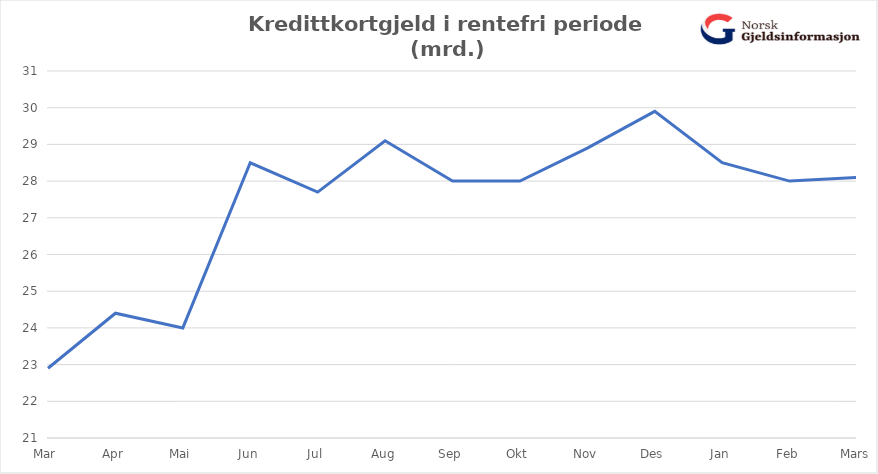
| Category | Ikke-rentebærende rammekreditt | Rentebærende rammekreditt |
|---|---|---|
| Mar | 22.9 |  |
| Apr | 24.4 |  |
| Mai | 24 |  |
| Jun | 28.5 |  |
| Jul | 27.7 |  |
| Aug | 29.1 |  |
| Sep | 28 |  |
| Okt | 28 |  |
| Nov | 28.9 |  |
| Des | 29.9 |  |
| Jan | 28.5 |  |
| Feb | 28 |  |
| Mars | 28.1 |  |